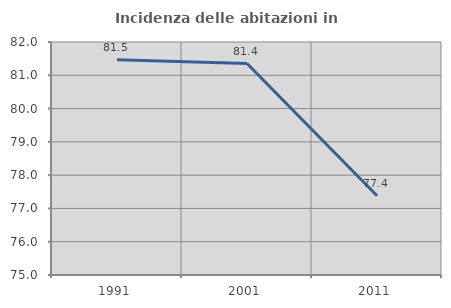
| Category | Incidenza delle abitazioni in proprietà  |
|---|---|
| 1991.0 | 81.468 |
| 2001.0 | 81.352 |
| 2011.0 | 77.382 |